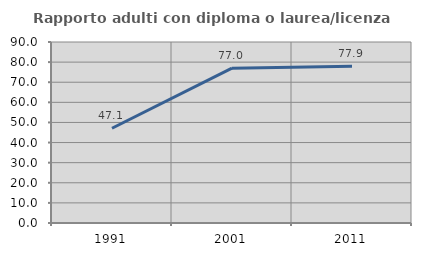
| Category | Rapporto adulti con diploma o laurea/licenza media  |
|---|---|
| 1991.0 | 47.119 |
| 2001.0 | 76.998 |
| 2011.0 | 77.889 |